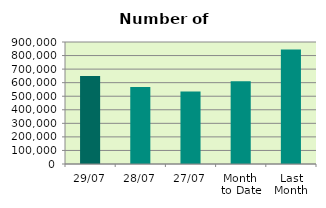
| Category | Series 0 |
|---|---|
| 29/07 | 648510 |
| 28/07 | 568862 |
| 27/07 | 534788 |
| Month 
to Date | 610978.095 |
| Last
Month | 844726.818 |